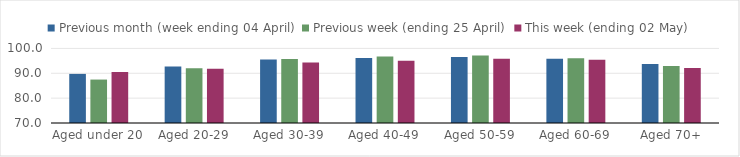
| Category | Previous month (week ending 04 April) | Previous week (ending 25 April) | This week (ending 02 May) |
|---|---|---|---|
| Aged under 20 | 89.757 | 87.475 | 90.51 |
| Aged 20-29 | 92.753 | 92.059 | 91.814 |
| Aged 30-39 | 95.58 | 95.745 | 94.291 |
| Aged 40-49 | 96.128 | 96.79 | 95.024 |
| Aged 50-59 | 96.558 | 97.125 | 95.818 |
| Aged 60-69 | 95.839 | 96.024 | 95.431 |
| Aged 70+ | 93.761 | 92.891 | 92.079 |